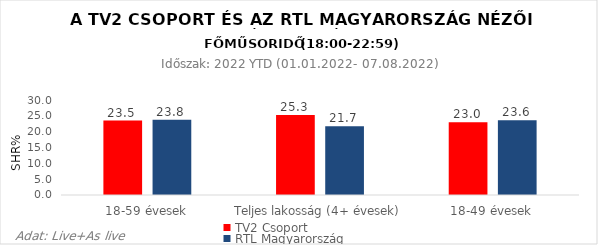
| Category | TV2 Csoport | RTL Magyarország |
|---|---|---|
| 18-59 évesek | 23.5 | 23.8 |
| Teljes lakosság (4+ évesek) | 25.3 | 21.7 |
| 18-49 évesek | 23 | 23.6 |